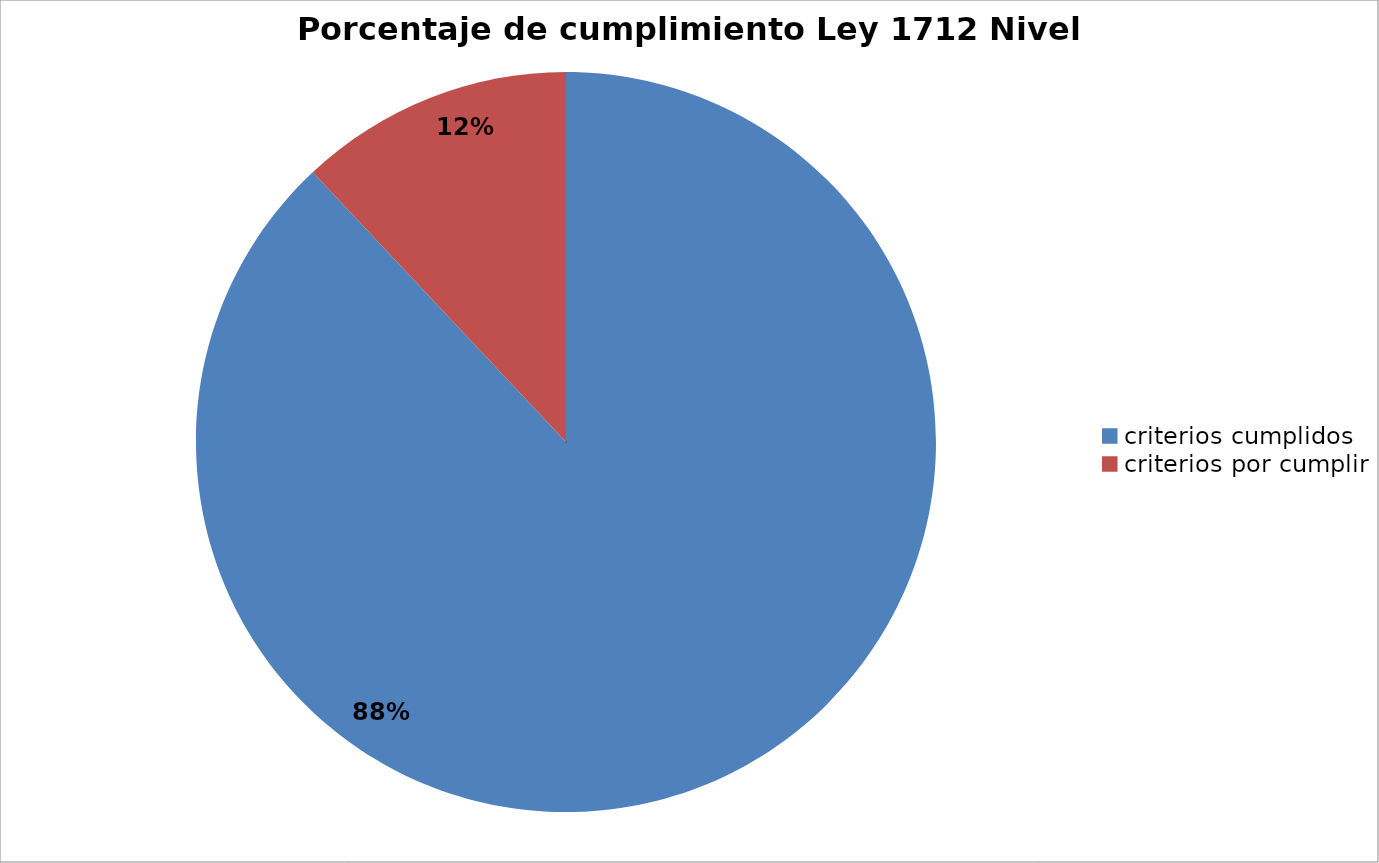
| Category | Series 0 |
|---|---|
| criterios cumplidos | 132 |
| criterios por cumplir | 18 |